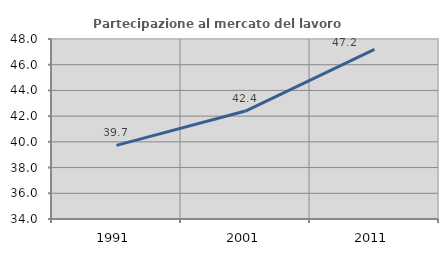
| Category | Partecipazione al mercato del lavoro  femminile |
|---|---|
| 1991.0 | 39.73 |
| 2001.0 | 42.396 |
| 2011.0 | 47.193 |